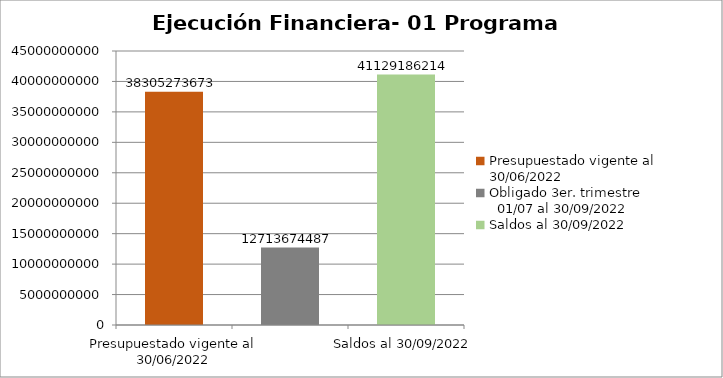
| Category | Presupuestado vigente al 30/06/2022 Obligado 3er. trimestre                      01/07 al 30/09/2022 Saldos al 30/09/2022 |
|---|---|
| Presupuestado vigente al 30/06/2022 | 38305273673 |
| Obligado 3er. trimestre                      01/07 al 30/09/2022 | 12713674487 |
| Saldos al 30/09/2022 | 41129186214 |